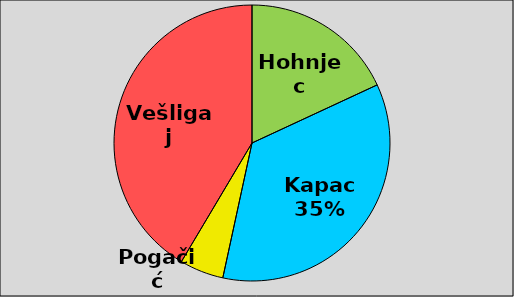
| Category | Series 0 |
|---|---|
| Hohnjec | 0.177 |
| Kapac | 0.346 |
| Pogačić | 0.05 |
| Vešligaj | 0.406 |